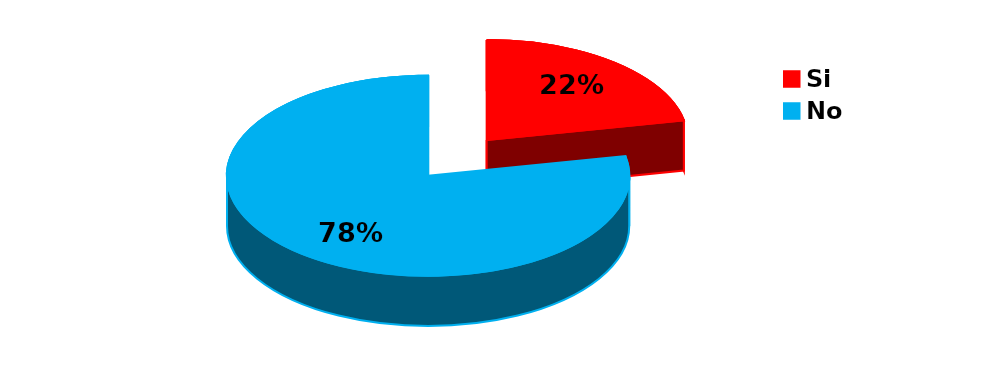
| Category | Series 0 |
|---|---|
| Si | 128 |
| No | 458 |